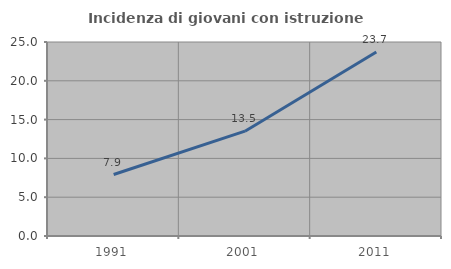
| Category | Incidenza di giovani con istruzione universitaria |
|---|---|
| 1991.0 | 7.925 |
| 2001.0 | 13.509 |
| 2011.0 | 23.711 |